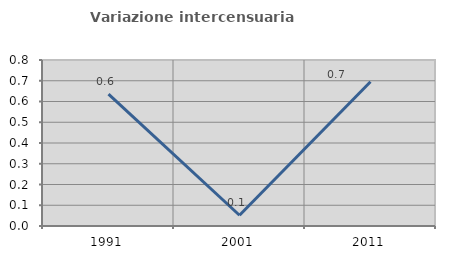
| Category | Variazione intercensuaria annua |
|---|---|
| 1991.0 | 0.635 |
| 2001.0 | 0.052 |
| 2011.0 | 0.695 |